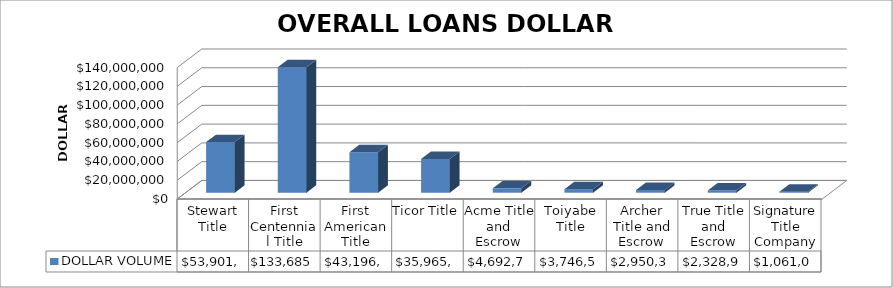
| Category | DOLLAR VOLUME |
|---|---|
| Stewart Title | 53901961 |
| First Centennial Title | 133685990 |
| First American Title | 43196235 |
| Ticor Title | 35965356 |
| Acme Title and Escrow | 4692713 |
| Toiyabe Title | 3746554 |
| Archer Title and Escrow | 2950350 |
| True Title and Escrow | 2328910 |
| Signature Title Company | 1061000 |